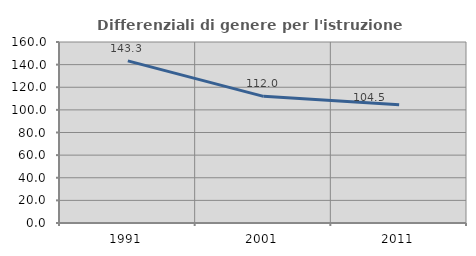
| Category | Differenziali di genere per l'istruzione superiore |
|---|---|
| 1991.0 | 143.316 |
| 2001.0 | 111.966 |
| 2011.0 | 104.473 |